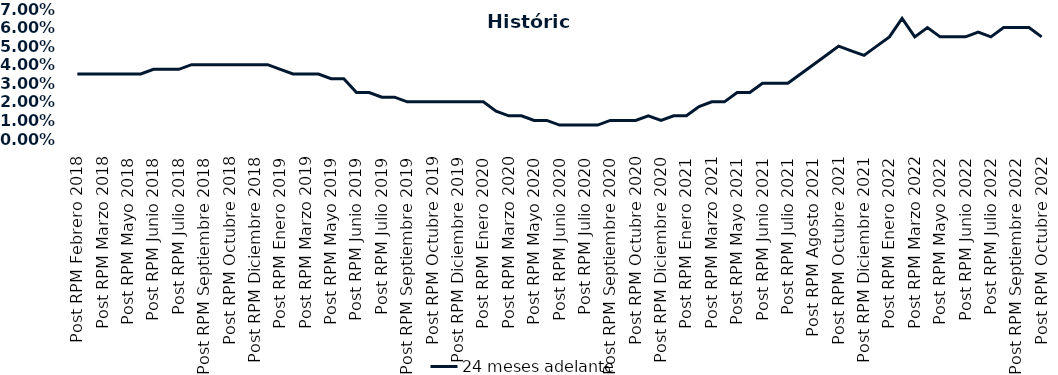
| Category | 24 meses adelante  |
|---|---|
| Post RPM Febrero 2018 | 0.035 |
| Pre RPM Marzo 2018 | 0.035 |
| Post RPM Marzo 2018 | 0.035 |
| Pre RPM Mayo 2018 | 0.035 |
| Post RPM Mayo 2018 | 0.035 |
| Pre RPM Junio 2018 | 0.035 |
| Post RPM Junio 2018 | 0.038 |
| Pre RPM Julio 2018 | 0.038 |
| Post RPM Julio 2018 | 0.038 |
| Pre RPM Septiembre 2018 | 0.04 |
| Post RPM Septiembre 2018 | 0.04 |
| Pre RPM Octubre 2018 | 0.04 |
| Post RPM Octubre 2018 | 0.04 |
| Pre RPM Diciembre 2018 | 0.04 |
| Post RPM Diciembre 2018 | 0.04 |
| Pre RPM Enero 2019 | 0.04 |
| Post RPM Enero 2019 | 0.038 |
| Pre RPM Marzo 2019 | 0.035 |
| Post RPM Marzo 2019 | 0.035 |
| Pre RPM Mayo 2019 | 0.035 |
| Post RPM Mayo 2019 | 0.032 |
| Pre RPM Junio 2019 | 0.032 |
| Post RPM Junio 2019 | 0.025 |
| Pre RPM Julio 2019 | 0.025 |
| Post RPM Julio 2019 | 0.022 |
| Pre RPM Septiembre 2019 | 0.022 |
| Post RPM Septiembre 2019 | 0.02 |
| Pre RPM Octubre 2019 | 0.02 |
| Post RPM Octubre 2019 | 0.02 |
| Pre RPM Diciembre 2019 | 0.02 |
| Post RPM Diciembre 2019 | 0.02 |
| Pre RPM Enero 2020 | 0.02 |
| Post RPM Enero 2020 | 0.02 |
| Pre RPM Marzo 2020 | 0.015 |
| Post RPM Marzo 2020 | 0.012 |
| Pre RPM Mayo 2020 | 0.012 |
| Post RPM Mayo 2020 | 0.01 |
| Pre RPM Junio 2020 | 0.01 |
| Post RPM Junio 2020 | 0.008 |
| Pre RPM Julio 2020 | 0.008 |
| Post RPM Julio 2020 | 0.008 |
| Pre RPM Septiembre 2020 | 0.008 |
| Post RPM Septiembre 2020 | 0.01 |
| Pre RPM Octubre 2020 | 0.01 |
| Post RPM Octubre 2020 | 0.01 |
| Pre RPM Diciembre 2020 | 0.012 |
| Post RPM Diciembre 2020 | 0.01 |
| Pre RPM Enero 2021 | 0.012 |
| Post RPM Enero 2021 | 0.012 |
| Pre RPM Marzo 2021 | 0.018 |
| Post RPM Marzo 2021 | 0.02 |
| Pre RPM Mayo 2021 | 0.02 |
| Post RPM Mayo 2021 | 0.025 |
| Pre RPM Junio 2021 | 0.025 |
| Post RPM Junio 2021 | 0.03 |
| Pre RPM Julio 2021 | 0.03 |
| Post RPM Julio 2021 | 0.03 |
| Pre RPM Agosto 2021 | 0.035 |
| Post RPM Agosto 2021 | 0.04 |
| Pre RPM Octubre 2021 | 0.045 |
| Post RPM Octubre 2021 | 0.05 |
| Pre RPM Diciembre 2021 | 0.048 |
| Post RPM Diciembre 2021 | 0.045 |
| Pre RPM Enero 2022 | 0.05 |
| Post RPM Enero 2022 | 0.055 |
| Pre RPM Marzo 2022 | 0.065 |
| Post RPM Marzo 2022 | 0.055 |
| Pre RPM Mayo 2022 | 0.06 |
| Post RPM Mayo 2022 | 0.055 |
| Pre RPM Junio 2022 | 0.055 |
| Post RPM Junio 2022 | 0.055 |
| Pre RPM Julio 2022 | 0.058 |
| Post RPM Julio 2022 | 0.055 |
| Pre RPM Septiembre 2022 | 0.06 |
| Post RPM Septiembre 2022 | 0.06 |
| Pre RPM Octubre 2022 | 0.06 |
| Post RPM Octubre 2022 | 0.055 |